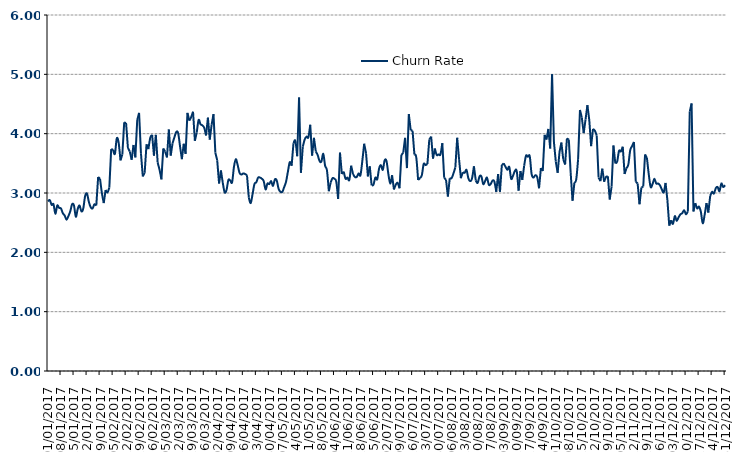
| Category | Churn Rate |
|---|---|
| 01/01/2017 | 2.86 |
| 02/01/2017 | 2.88 |
| 03/01/2017 | 2.8 |
| 04/01/2017 | 2.81 |
| 05/01/2017 | 2.65 |
| 06/01/2017 | 2.79 |
| 07/01/2017 | 2.75 |
| 08/01/2017 | 2.74 |
| 09/01/2017 | 2.66 |
| 10/01/2017 | 2.62 |
| 11/01/2017 | 2.55 |
| 12/01/2017 | 2.61 |
| 13/01/2017 | 2.69 |
| 14/01/2017 | 2.81 |
| 15/01/2017 | 2.79 |
| 16/01/2017 | 2.6 |
| 17/01/2017 | 2.73 |
| 18/01/2017 | 2.79 |
| 19/01/2017 | 2.69 |
| 20/01/2017 | 2.74 |
| 21/01/2017 | 2.95 |
| 22/01/2017 | 2.99 |
| 23/01/2017 | 2.85 |
| 24/01/2017 | 2.76 |
| 25/01/2017 | 2.74 |
| 26/01/2017 | 2.81 |
| 27/01/2017 | 2.79 |
| 28/01/2017 | 3.27 |
| 29/01/2017 | 3.24 |
| 30/01/2017 | 3 |
| 31/01/2017 | 2.83 |
| 01/02/2017 | 3.05 |
| 02/02/2017 | 3.01 |
| 03/02/2017 | 3.09 |
| 04/02/2017 | 3.74 |
| 05/02/2017 | 3.73 |
| 06/02/2017 | 3.66 |
| 07/02/2017 | 3.92 |
| 08/02/2017 | 3.85 |
| 09/02/2017 | 3.55 |
| 10/02/2017 | 3.65 |
| 11/02/2017 | 4.19 |
| 12/02/2017 | 4.18 |
| 13/02/2017 | 3.76 |
| 14/02/2017 | 3.7 |
| 15/02/2017 | 3.56 |
| 16/02/2017 | 3.81 |
| 17/02/2017 | 3.6 |
| 18/02/2017 | 4.23 |
| 19/02/2017 | 4.35 |
| 20/02/2017 | 3.67 |
| 21/02/2017 | 3.28 |
| 22/02/2017 | 3.34 |
| 23/02/2017 | 3.82 |
| 24/02/2017 | 3.74 |
| 25/02/2017 | 3.93 |
| 26/02/2017 | 3.98 |
| 27/02/2017 | 3.63 |
| 28/02/2017 | 3.98 |
| 01/03/2017 | 3.51 |
| 02/03/2017 | 3.39 |
| 03/03/2017 | 3.23 |
| 04/03/2017 | 3.75 |
| 05/03/2017 | 3.7 |
| 06/03/2017 | 3.6 |
| 07/03/2017 | 4.07 |
| 08/03/2017 | 3.63 |
| 09/03/2017 | 3.84 |
| 10/03/2017 | 3.94 |
| 11/03/2017 | 4.03 |
| 12/03/2017 | 4.01 |
| 13/03/2017 | 3.79 |
| 14/03/2017 | 3.57 |
| 15/03/2017 | 3.83 |
| 16/03/2017 | 3.66 |
| 17/03/2017 | 4.35 |
| 18/03/2017 | 4.22 |
| 19/03/2017 | 4.28 |
| 20/03/2017 | 4.37 |
| 21/03/2017 | 3.88 |
| 22/03/2017 | 4.02 |
| 23/03/2017 | 4.23 |
| 24/03/2017 | 4.16 |
| 25/03/2017 | 4.14 |
| 26/03/2017 | 4.1 |
| 27/03/2017 | 3.97 |
| 28/03/2017 | 4.27 |
| 29/03/2017 | 3.9 |
| 30/03/2017 | 4.15 |
| 31/03/2017 | 4.33 |
| 01/04/2017 | 3.68 |
| 02/04/2017 | 3.55 |
| 03/04/2017 | 3.16 |
| 04/04/2017 | 3.38 |
| 05/04/2017 | 3.17 |
| 06/04/2017 | 3.01 |
| 07/04/2017 | 3.05 |
| 08/04/2017 | 3.22 |
| 09/04/2017 | 3.21 |
| 10/04/2017 | 3.18 |
| 11/04/2017 | 3.44 |
| 12/04/2017 | 3.57 |
| 13/04/2017 | 3.47 |
| 14/04/2017 | 3.34 |
| 15/04/2017 | 3.31 |
| 16/04/2017 | 3.33 |
| 17/04/2017 | 3.32 |
| 18/04/2017 | 3.3 |
| 19/04/2017 | 2.92 |
| 20/04/2017 | 2.83 |
| 21/04/2017 | 2.98 |
| 22/04/2017 | 3.15 |
| 23/04/2017 | 3.18 |
| 24/04/2017 | 3.26 |
| 25/04/2017 | 3.26 |
| 26/04/2017 | 3.24 |
| 27/04/2017 | 3.2 |
| 28/04/2017 | 3.06 |
| 29/04/2017 | 3.16 |
| 30/04/2017 | 3.15 |
| 01/05/2017 | 3.2 |
| 02/05/2017 | 3.12 |
| 03/05/2017 | 3.23 |
| 04/05/2017 | 3.21 |
| 05/05/2017 | 3.07 |
| 06/05/2017 | 3.02 |
| 07/05/2017 | 3.02 |
| 08/05/2017 | 3.1 |
| 09/05/2017 | 3.19 |
| 10/05/2017 | 3.36 |
| 11/05/2017 | 3.52 |
| 12/05/2017 | 3.46 |
| 13/05/2017 | 3.84 |
| 14/05/2017 | 3.88 |
| 15/05/2017 | 3.62 |
| 16/05/2017 | 4.61 |
| 17/05/2017 | 3.34 |
| 18/05/2017 | 3.78 |
| 19/05/2017 | 3.9 |
| 20/05/2017 | 3.95 |
| 21/05/2017 | 3.94 |
| 22/05/2017 | 4.15 |
| 23/05/2017 | 3.63 |
| 24/05/2017 | 3.93 |
| 25/05/2017 | 3.7 |
| 26/05/2017 | 3.64 |
| 27/05/2017 | 3.54 |
| 28/05/2017 | 3.53 |
| 29/05/2017 | 3.66 |
| 30/05/2017 | 3.46 |
| 31/05/2017 | 3.38 |
| 01/06/2017 | 3.03 |
| 02/06/2017 | 3.18 |
| 03/06/2017 | 3.25 |
| 04/06/2017 | 3.24 |
| 05/06/2017 | 3.19 |
| 06/06/2017 | 2.9 |
| 07/06/2017 | 3.68 |
| 08/06/2017 | 3.32 |
| 09/06/2017 | 3.36 |
| 10/06/2017 | 3.24 |
| 11/06/2017 | 3.26 |
| 12/06/2017 | 3.22 |
| 13/06/2017 | 3.46 |
| 14/06/2017 | 3.32 |
| 15/06/2017 | 3.27 |
| 16/06/2017 | 3.27 |
| 17/06/2017 | 3.33 |
| 18/06/2017 | 3.3 |
| 19/06/2017 | 3.54 |
| 20/06/2017 | 3.83 |
| 21/06/2017 | 3.67 |
| 22/06/2017 | 3.28 |
| 23/06/2017 | 3.45 |
| 24/06/2017 | 3.13 |
| 25/06/2017 | 3.14 |
| 26/06/2017 | 3.26 |
| 27/06/2017 | 3.23 |
| 28/06/2017 | 3.41 |
| 29/06/2017 | 3.47 |
| 30/06/2017 | 3.39 |
| 01/07/2017 | 3.55 |
| 02/07/2017 | 3.54 |
| 03/07/2017 | 3.32 |
| 04/07/2017 | 3.16 |
| 05/07/2017 | 3.3 |
| 06/07/2017 | 3.06 |
| 07/07/2017 | 3.14 |
| 08/07/2017 | 3.17 |
| 09/07/2017 | 3.08 |
| 10/07/2017 | 3.64 |
| 11/07/2017 | 3.68 |
| 12/07/2017 | 3.93 |
| 13/07/2017 | 3.42 |
| 14/07/2017 | 4.33 |
| 15/07/2017 | 4.06 |
| 16/07/2017 | 4.05 |
| 17/07/2017 | 3.65 |
| 18/07/2017 | 3.6 |
| 19/07/2017 | 3.22 |
| 20/07/2017 | 3.25 |
| 21/07/2017 | 3.3 |
| 22/07/2017 | 3.49 |
| 23/07/2017 | 3.47 |
| 24/07/2017 | 3.49 |
| 25/07/2017 | 3.9 |
| 26/07/2017 | 3.95 |
| 27/07/2017 | 3.58 |
| 28/07/2017 | 3.75 |
| 29/07/2017 | 3.64 |
| 30/07/2017 | 3.65 |
| 31/07/2017 | 3.65 |
| 01/08/2017 | 3.84 |
| 02/08/2017 | 3.26 |
| 03/08/2017 | 3.22 |
| 04/08/2017 | 2.94 |
| 05/08/2017 | 3.25 |
| 06/08/2017 | 3.25 |
| 07/08/2017 | 3.33 |
| 08/08/2017 | 3.43 |
| 09/08/2017 | 3.93 |
| 10/08/2017 | 3.57 |
| 11/08/2017 | 3.25 |
| 12/08/2017 | 3.35 |
| 13/08/2017 | 3.34 |
| 14/08/2017 | 3.39 |
| 15/08/2017 | 3.25 |
| 16/08/2017 | 3.2 |
| 17/08/2017 | 3.25 |
| 18/08/2017 | 3.45 |
| 19/08/2017 | 3.21 |
| 20/08/2017 | 3.17 |
| 21/08/2017 | 3.28 |
| 22/08/2017 | 3.28 |
| 23/08/2017 | 3.15 |
| 24/08/2017 | 3.2 |
| 25/08/2017 | 3.26 |
| 26/08/2017 | 3.14 |
| 27/08/2017 | 3.15 |
| 28/08/2017 | 3.21 |
| 29/08/2017 | 3.19 |
| 30/08/2017 | 3.02 |
| 31/08/2017 | 3.32 |
| 01/09/2017 | 3.02 |
| 02/09/2017 | 3.47 |
| 03/09/2017 | 3.5 |
| 04/09/2017 | 3.44 |
| 05/09/2017 | 3.39 |
| 06/09/2017 | 3.44 |
| 07/09/2017 | 3.24 |
| 08/09/2017 | 3.29 |
| 09/09/2017 | 3.37 |
| 10/09/2017 | 3.37 |
| 11/09/2017 | 3.04 |
| 12/09/2017 | 3.37 |
| 13/09/2017 | 3.22 |
| 14/09/2017 | 3.46 |
| 15/09/2017 | 3.63 |
| 16/09/2017 | 3.61 |
| 17/09/2017 | 3.62 |
| 18/09/2017 | 3.32 |
| 19/09/2017 | 3.26 |
| 20/09/2017 | 3.3 |
| 21/09/2017 | 3.27 |
| 22/09/2017 | 3.08 |
| 23/09/2017 | 3.42 |
| 24/09/2017 | 3.37 |
| 25/09/2017 | 3.98 |
| 26/09/2017 | 3.9 |
| 27/09/2017 | 4.08 |
| 28/09/2017 | 3.75 |
| 29/09/2017 | 5 |
| 30/09/2017 | 3.86 |
| 01/10/2017 | 3.53 |
| 02/10/2017 | 3.34 |
| 03/10/2017 | 3.69 |
| 04/10/2017 | 3.85 |
| 05/10/2017 | 3.57 |
| 06/10/2017 | 3.48 |
| 07/10/2017 | 3.92 |
| 08/10/2017 | 3.9 |
| 09/10/2017 | 3.34 |
| 10/10/2017 | 2.87 |
| 11/10/2017 | 3.17 |
| 12/10/2017 | 3.23 |
| 13/10/2017 | 3.57 |
| 14/10/2017 | 4.4 |
| 15/10/2017 | 4.27 |
| 16/10/2017 | 4.01 |
| 17/10/2017 | 4.24 |
| 18/10/2017 | 4.48 |
| 19/10/2017 | 4.23 |
| 20/10/2017 | 3.79 |
| 21/10/2017 | 4.08 |
| 22/10/2017 | 4.05 |
| 23/10/2017 | 3.97 |
| 24/10/2017 | 3.26 |
| 25/10/2017 | 3.2 |
| 26/10/2017 | 3.41 |
| 27/10/2017 | 3.19 |
| 28/10/2017 | 3.27 |
| 29/10/2017 | 3.28 |
| 30/10/2017 | 2.89 |
| 31/10/2017 | 3.11 |
| 01/11/2017 | 3.8 |
| 02/11/2017 | 3.5 |
| 03/11/2017 | 3.53 |
| 04/11/2017 | 3.71 |
| 05/11/2017 | 3.7 |
| 06/11/2017 | 3.78 |
| 07/11/2017 | 3.32 |
| 08/11/2017 | 3.42 |
| 09/11/2017 | 3.48 |
| 10/11/2017 | 3.72 |
| 11/11/2017 | 3.79 |
| 12/11/2017 | 3.86 |
| 13/11/2017 | 3.19 |
| 14/11/2017 | 3.16 |
| 15/11/2017 | 2.81 |
| 16/11/2017 | 3.09 |
| 17/11/2017 | 3.11 |
| 18/11/2017 | 3.65 |
| 19/11/2017 | 3.59 |
| 20/11/2017 | 3.31 |
| 21/11/2017 | 3.1 |
| 22/11/2017 | 3.15 |
| 23/11/2017 | 3.24 |
| 24/11/2017 | 3.16 |
| 25/11/2017 | 3.16 |
| 26/11/2017 | 3.13 |
| 27/11/2017 | 3.06 |
| 28/11/2017 | 3.01 |
| 29/11/2017 | 3.17 |
| 30/11/2017 | 2.88 |
| 01/12/2017 | 2.45 |
| 02/12/2017 | 2.54 |
| 03/12/2017 | 2.48 |
| 04/12/2017 | 2.61 |
| 05/12/2017 | 2.53 |
| 06/12/2017 | 2.59 |
| 07/12/2017 | 2.64 |
| 08/12/2017 | 2.66 |
| 09/12/2017 | 2.71 |
| 10/12/2017 | 2.64 |
| 11/12/2017 | 2.69 |
| 12/12/2017 | 4.37 |
| 13/12/2017 | 4.51 |
| 14/12/2017 | 2.69 |
| 15/12/2017 | 2.83 |
| 16/12/2017 | 2.74 |
| 17/12/2017 | 2.77 |
| 18/12/2017 | 2.68 |
| 19/12/2017 | 2.49 |
| 20/12/2017 | 2.63 |
| 21/12/2017 | 2.83 |
| 22/12/2017 | 2.67 |
| 23/12/2017 | 2.95 |
| 24/12/2017 | 3.02 |
| 25/12/2017 | 2.99 |
| 26/12/2017 | 3.08 |
| 27/12/2017 | 3.1 |
| 28/12/2017 | 3.03 |
| 29/12/2017 | 3.16 |
| 30/12/2017 | 3.1 |
| 31/12/2017 | 3.13 |